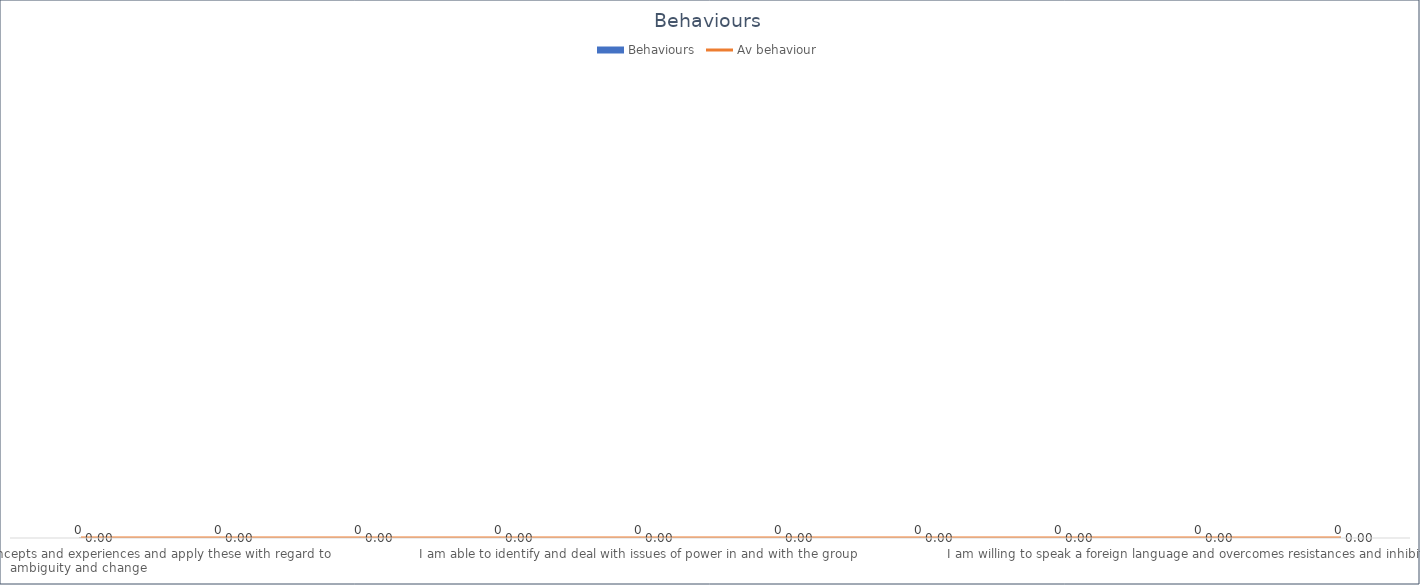
| Category | Behaviours |
|---|---|
| I can reflect on theories, concepts and experiences and apply these with regard to ambiguity and change  | 0 |
| I explicitly wrestle with my own biases, assumptions and behaviours regarding stereotypes | 0 |
| I encourage young people to reflect on their own identity and related elements | 0 |
| I explore the complex connections, among others, between identity, politics, society and history  | 0 |
| I am able to identify and deal with issues of power in and with the group | 0 |
| I facilitate awareness-raising with regard to conflicts that exist in the society and how they relate to intercultural dialogue | 0 |
| I recognise and interpret words, body language and non-verbal communication in a culturally-appropriate manner | 0 |
| I encourage self-confidence and demonstrate [a framed] flexibility in cultural and communicative behaviour | 0 |
| I am willing to speak a foreign language and overcomes resistances and inhibitions | 0 |
| I encourage young people to reflect and exchange ideas regarding issues such as solidarity, social justice, promoting/protecting human rights, discrimination, dignity and equality  | 0 |